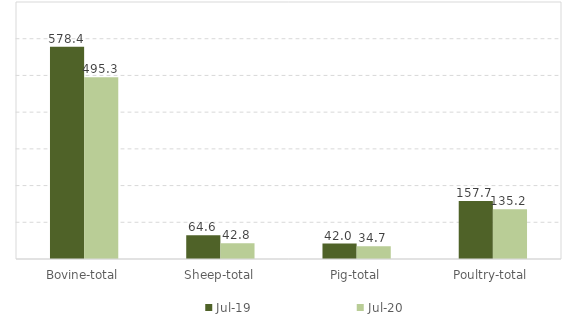
| Category | Jul-19 | Jul-20 |
|---|---|---|
| Bovine-total | 578.4 | 495.3 |
| Sheep-total | 64.6 | 42.8 |
| Pig-total | 42 | 34.7 |
| Poultry-total | 157.7 | 135.2 |